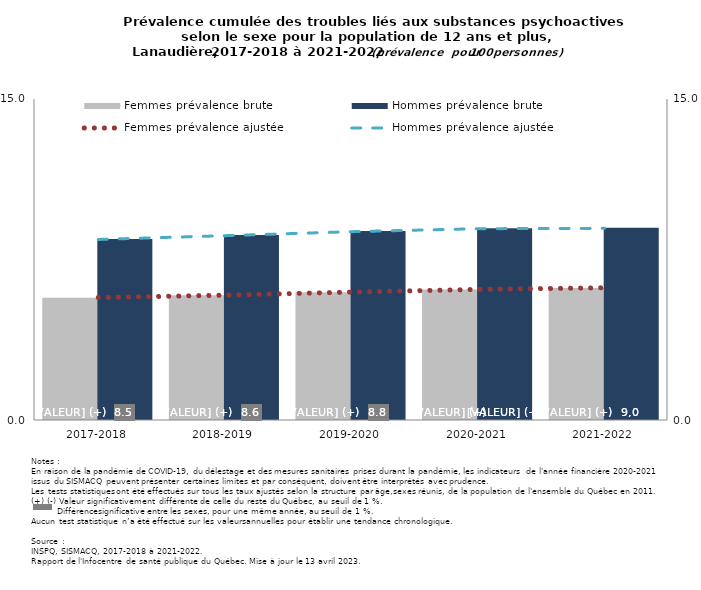
| Category | Femmes prévalence brute | Hommes prévalence brute |
|---|---|---|
| 2017-2018 | 5.718 | 8.455 |
| 2018-2019 | 5.835 | 8.64 |
| 2019-2020 | 5.971 | 8.826 |
| 2020-2021 | 6.095 | 8.962 |
| 2021-2022 | 6.17 | 8.98 |